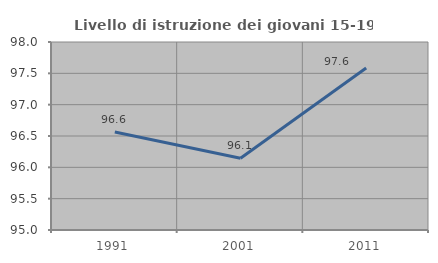
| Category | Livello di istruzione dei giovani 15-19 anni |
|---|---|
| 1991.0 | 96.563 |
| 2001.0 | 96.144 |
| 2011.0 | 97.585 |